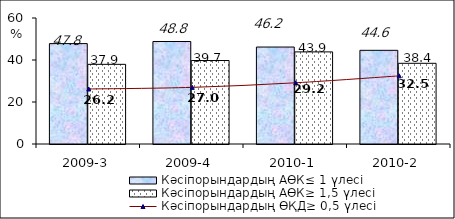
| Category | Кәсіпорындардың АӨК≤ 1 үлесі | Кәсіпорындардың АӨК≥ 1,5 үлесі |
|---|---|---|
| 2009-3 | 47.811 | 37.935 |
| 2009-4 | 48.803 | 39.749 |
| 2010-1 | 46.171 | 43.856 |
| 2010-2 | 44.607 | 38.427 |